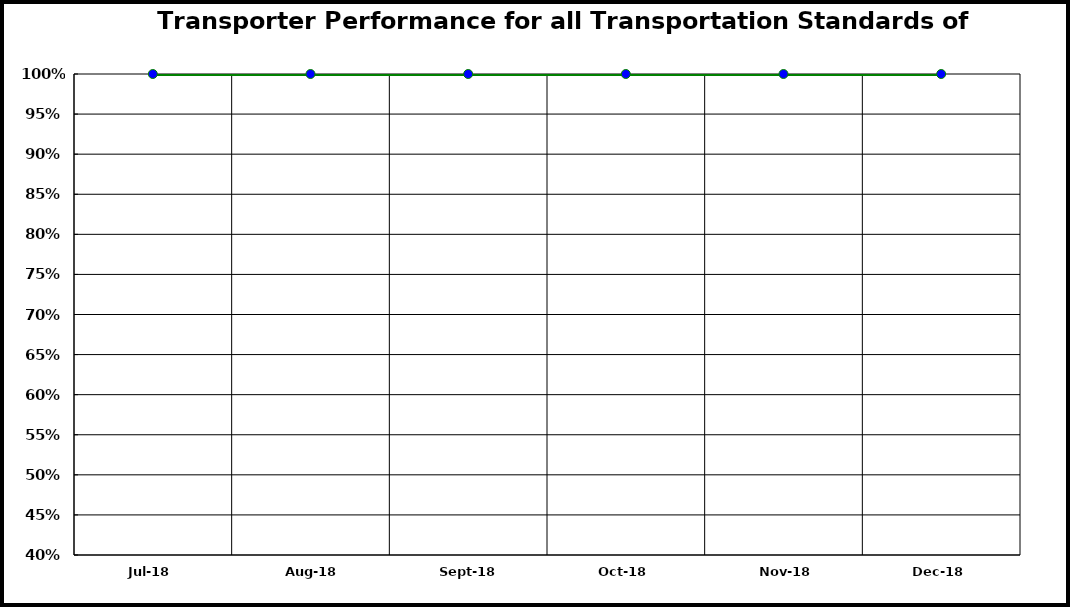
| Category | Performance |
|---|---|
| 2018-07-01 | 1 |
| 2018-08-01 | 1 |
| 2018-09-01 | 1 |
| 2018-10-01 | 1 |
| 2018-11-01 | 1 |
| 2018-12-01 | 1 |